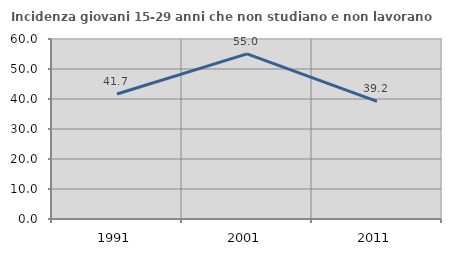
| Category | Incidenza giovani 15-29 anni che non studiano e non lavorano  |
|---|---|
| 1991.0 | 41.667 |
| 2001.0 | 55.026 |
| 2011.0 | 39.224 |